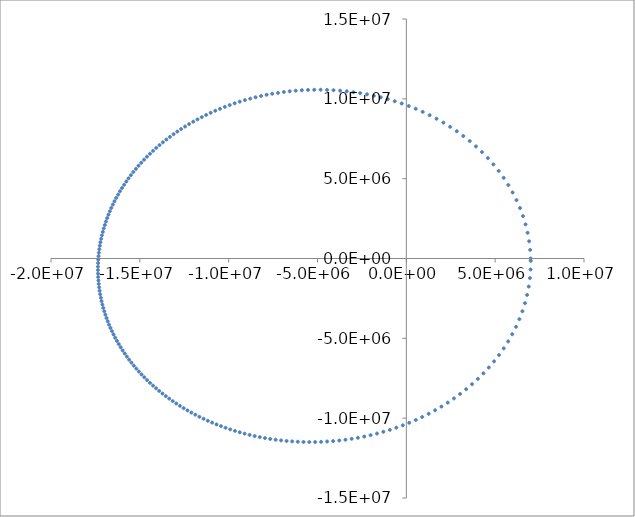
| Category | y |
|---|---|
| 7000000.0 | 0 |
| 6970744.563265306 | 540000 |
| 6912251.19396686 | 1077735.036 |
| 6824816.625513151 | 1610957.658 |
| 6709009.4310104735 | 2137483.088 |
| 6565653.226616006 | 2655231.435 |
| 6395801.678400131 | 3162264.736 |
| 6200707.089399071 | 3656817.166 |
| 5981784.687012239 | 4137317.334 |
| 5740574.829026614 | 4602402.325 |
| 5478705.218540237 | 5050923.731 |
| 5197854.914966646 | 5481946.471 |
| 4899721.517702771 | 5894741.501 |
| 4585992.449481038 | 6288773.74 |
| 4258320.835542583 | 6663686.56 |
| 3918306.102838631 | 7019284.096 |
| 3567479.1321585556 | 7355512.504 |
| 3207291.590969546 | 7672441.068 |
| 2839108.949750725 | 7970243.857 |
| 2464206.6267520357 | 8249182.453 |
| 2083768.6996600197 | 8509590.05 |
| 1698888.6520331213 | 8751857.139 |
| 1310571.6739488316 | 8976418.815 |
| 919738.099204333 | 9183743.719 |
| 527227.6276234799 | 9374324.518 |
| 133804.04512586695 | 9548669.829 |
| -259839.78709651792 | 9707297.439 |
| -653076.8513775594 | 9850728.696 |
| -1045340.9335550781 | 9979483.911 |
| -1436121.7209901046 | 10094078.659 |
| -1824960.1060825104 | 10195020.83 |
| -2211443.739451374 | 10282808.334 |
| -2595202.858888744 | 10357927.348 |
| -2975906.406487652 | 10420851.017 |
| -3353258.4361841767 | 10472038.542 |
| -3726994.8066295404 | 10511934.565 |
| -4096880.1492158156 | 10540968.82 |
| -4462705.097712915 | 10559555.982 |
| -4824283.763922688 | 10568095.683 |
| -5181451.442686592 | 10566972.657 |
| -5534062.529234172 | 10556556.987 |
| -5881988.632025207 | 10537204.428 |
| -6225116.864760888 | 10509256.794 |
| -6563348.301998051 | 10473042.378 |
| -6896596.583705077 | 10428876.411 |
| -7224786.655081403 | 10377061.534 |
| -7547853.628976233 | 10317888.281 |
| -7865741.759251226 | 10251635.567 |
| -8178403.514413005 | 10178571.176 |
| -8485798.741778295 | 10098952.238 |
| -8787893.913317755 | 10013025.702 |
| -9084661.445148611 | 9921028.793 |
| -9376079.083408963 | 9823189.46 |
| -9662129.349948052 | 9719726.805 |
| -9942799.041908627 | 9610851.501 |
| -10218078.779862298 | 9496766.19 |
| -10487962.59968984 | 9377665.869 |
| -10752447.583879305 | 9253738.254 |
| -11011533.528349387 | 9125164.134 |
| -11265222.64129739 | 8992117.706 |
| -11513519.270924263 | 8854766.893 |
| -11756429.659206644 | 8713273.654 |
| -11993961.719171474 | 8567794.269 |
| -12226124.833385004 | 8418479.619 |
| -12452929.671598358 | 8265475.448 |
| -12674388.025698323 | 8108922.615 |
| -12890512.66029749 | 7948957.333 |
| -13101317.17746417 | 7785711.39 |
| -13306815.894241726 | 7619312.373 |
| -13507023.731740918 | 7449883.867 |
| -13701956.114708986 | 7277545.65 |
| -13891628.880587097 | 7102413.883 |
| -14076058.197164647 | 6924601.282 |
| -14255260.488025913 | 6744217.289 |
| -14429252.365062729 | 6561368.229 |
| -14598050.567397162 | 6376157.466 |
| -14761671.906121355 | 6188685.545 |
| -14920133.214318583 | 5999050.332 |
| -15073451.301880807 | 5807347.146 |
| -15221642.914684094 | 5613668.884 |
| -15364724.697724873 | 5418106.14 |
| -15502713.161857456 | 5220747.326 |
| -15635624.653807143 | 5021678.772 |
| -15763475.329163691 | 4820984.841 |
| -15886281.128087612 | 4618748.022 |
| -16004057.753486654 | 4415049.031 |
| -16116820.651442446 | 4209966.899 |
| -16224584.993687695 | 4003579.066 |
| -16327365.661952896 | 3795961.462 |
| -16425177.234018262 | 3587188.589 |
| -16518033.971321894 | 3377333.601 |
| -16605949.807989035 | 3166468.379 |
| -16688938.341159865 | 2954663.606 |
| -16767012.82250477 | 2741988.833 |
| -16840186.1508265 | 2528512.551 |
| -16908470.865658138 | 2314302.257 |
| -16971879.141774587 | 2099424.512 |
| -17030422.784543216 | 1883945.011 |
| -17084113.22604665 | 1667928.638 |
| -17132961.52191748 | 1451439.525 |
| -17176978.34883072 | 1234541.108 |
| -17216174.002605736 | 1017296.184 |
| -17250558.396874543 | 799766.965 |
| -17280141.062278263 | 582015.129 |
| -17304931.14615823 | 364101.873 |
| -17324937.412712343 | 146087.964 |
| -17340168.24359143 | -71966.212 |
| -17350631.63891401 | -290000.602 |
| -17356335.21868154 | -507955.437 |
| -17357286.22457958 | -725771.181 |
| -17353491.522153556 | -943388.489 |
| -17344957.603351016 | -1160748.16 |
| -17331690.589425206 | -1377791.085 |
| -17313696.23419791 | -1594458.208 |
| -17290979.927682284 | -1810690.476 |
| -17263546.70006942 | -2026428.793 |
| -17231401.22608523 | -2241613.978 |
| -17194547.829727143 | -2456186.714 |
| -17152990.48939307 | -2670087.507 |
| -17106732.843418103 | -2883256.636 |
| -17055778.196037494 | -3095634.108 |
| -17000129.52379764 | -3307159.611 |
| -16939789.48244017 | -3517772.469 |
| -16874760.41428762 | -3727411.587 |
| -16805044.356162902 | -3936015.412 |
| -16730643.047878593 | -4143521.874 |
| -16651557.941336146 | -4349868.344 |
| -16567790.210279511 | -4554991.577 |
| -16479340.760752266 | -4758827.662 |
| -16386210.242312359 | -4961311.97 |
| -16288399.060063925 | -5162379.097 |
| -16185907.387571394 | -5361962.808 |
| -16078735.180727351 | -5559995.982 |
| -15966882.19265237 | -5756410.551 |
| -15850347.989712322 | -5951137.439 |
| -15729131.968746645 | -6144106.502 |
| -15603233.375609674 | -6335246.461 |
| -15472651.325136542 | -6524484.836 |
| -15337384.822655443 | -6711747.878 |
| -15197432.787179217 | -6896960.497 |
| -15052794.076421497 | -7080046.191 |
| -14903467.513796004 | -7260926.965 |
| -14749451.917572256 | -7439523.255 |
| -14590746.132377045 | -7615753.845 |
| -14427349.063248578 | -7789535.783 |
| -14259259.712469608 | -7960784.29 |
| -14086477.219427008 | -8129412.669 |
| -13909000.903768688 | -8295332.207 |
| -13726830.31215431 | -8458452.077 |
| -13539965.26892459 | -8618679.234 |
| -13348405.931045037 | -8775918.301 |
| -13152152.84771425 | -8930071.462 |
| -12951207.025064707 | -9081038.34 |
| -12745569.996425614 | -9228715.869 |
| -12535243.898663465 | -9372998.173 |
| -12320231.555166662 | -9513776.423 |
| -12100536.566096755 | -9650938.698 |
| -11876163.40659086 | -9784369.839 |
| -11647117.533668395 | -9913951.288 |
| -11413405.502671171 | -10039560.934 |
| -11175035.094149811 | -10161072.937 |
| -10932015.452202432 | -10278357.552 |
| -10684357.235374367 | -10391280.947 |
| -10432072.781341666 | -10499705.004 |
| -10175176.286727265 | -10603487.12 |
| -9913684.003538447 | -10702479.994 |
| -9647614.45386894 | -10796531.405 |
| -9376988.664680354 | -10885483.982 |
| -9101830.424667235 | -10969174.964 |
| -8822166.565419918 | -11047435.947 |
| -8538027.269331302 | -11120092.626 |
| -8249446.406950061 | -11186964.523 |
| -7956461.906765721 | -11247864.705 |
| -7659116.160722983 | -11302599.496 |
| -7357456.469105938 | -11350968.174 |
| -7051535.528809913 | -11392762.664 |
| -6741411.969431905 | -11427767.223 |
| -6427150.942061983 | -11455758.115 |
| -6108824.766149465 | -11476503.283 |
| -5786513.640350186 | -11489762.021 |
| -5460306.423835063 | -11495284.64 |
| -5130301.495154339 | -11492812.144 |
| -4796607.696403455 | -11482075.905 |
| -4459345.371120103 | -11462797.36 |
| -4118647.5050487584 | -11434687.718 |
| -3774660.979625598 | -11397447.703 |
| -3427547.9487436363 | -11350767.321 |
| -3077487.35002792 | -11294325.687 |
| -2724676.5624459777 | -11227790.908 |
| -2369333.222548536 | -11150820.04 |
| -2011697.2119119558 | -11063059.149 |
| -1652032.8283475153 | -10964143.493 |
| -1290631.1530374298 | -10853697.851 |
| -927812.6248037221 | -10731337.036 |
| -563929.8310233471 | -10596666.631 |
| -199370.52203164966 | -10449283.996 |
| 165439.14809167333 | -10288779.588 |
| 530031.1570497494 | -10114738.676 |
| 893891.9365368251 | -9926743.5 |
| 1256458.5017715553 | -9724375.968 |
| 1617114.4224794637 | -9507220.979 |
| 1975185.6868037838 | -9274870.467 |
| 2329936.531567505 | -9026928.276 |
| 2680565.3395496192 | -8763015.98 |
| 3026200.737594353 | -8482779.765 |
| 3365898.0688451957 | -8185898.484 |
| 3698636.458182598 | -7872092.985 |
| 4023316.741380102 | -7541136.798 |
| 4338760.583918037 | -7192868.212 |
| 4643711.17175058 | -6827203.737 |
| 4936835.908721885 | -6444152.847 |
| 5216731.5966440765 | -6043833.808 |
| 5481932.594670278 | -5626490.266 |
| 5730922.442500641 | -5192508.088 |
| 5962149.373377743 | -4742431.802 |
| 6174046.023716108 | -4276979.762 |
| 6365053.454760613 | -3797057.023 |
| 6533649.331863583 | -3303764.725 |
| 6678379.762867348 | -2798404.774 |
| 6797893.897001975 | -2282478.577 |
| 6890979.965010624 | -1757678.823 |
| 6956601.051935552 | -1225873.59 |
| 6993928.599892051 | -689082.545 |
| 7002371.504531736 | -149445.618 |